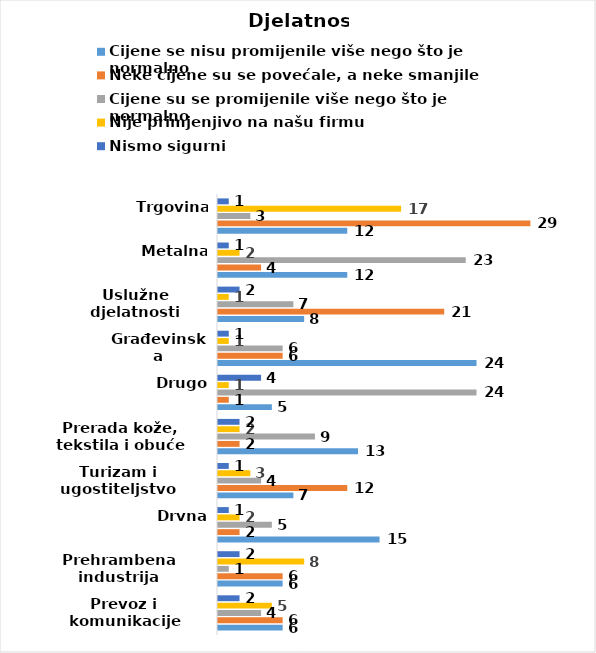
| Category | Cijene se nisu promijenile više nego što je normalno | Neke cijene su se povećale, a neke smanjile | Cijene su se promijenile više nego što je normalno | Nije primjenjivo na našu firmu | Nismo sigurni |
|---|---|---|---|---|---|
| Prevoz i komunikacije | 6 | 6 | 4 | 5 | 2 |
| Prehrambena industrija | 6 | 6 | 1 | 8 | 2 |
| Drvna | 15 | 2 | 5 | 2 | 1 |
| Turizam i ugostiteljstvo | 7 | 12 | 4 | 3 | 1 |
| Prerada kože, tekstila i obuće | 13 | 2 | 9 | 2 | 2 |
| Drugo | 5 | 1 | 24 | 1 | 4 |
| Građevinska | 24 | 6 | 6 | 1 | 1 |
| Uslužne djelatnosti | 8 | 21 | 7 | 1 | 2 |
| Metalna | 12 | 4 | 23 | 2 | 1 |
| Trgovina | 12 | 29 | 3 | 17 | 1 |